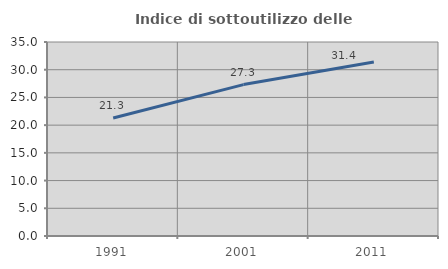
| Category | Indice di sottoutilizzo delle abitazioni  |
|---|---|
| 1991.0 | 21.294 |
| 2001.0 | 27.315 |
| 2011.0 | 31.381 |